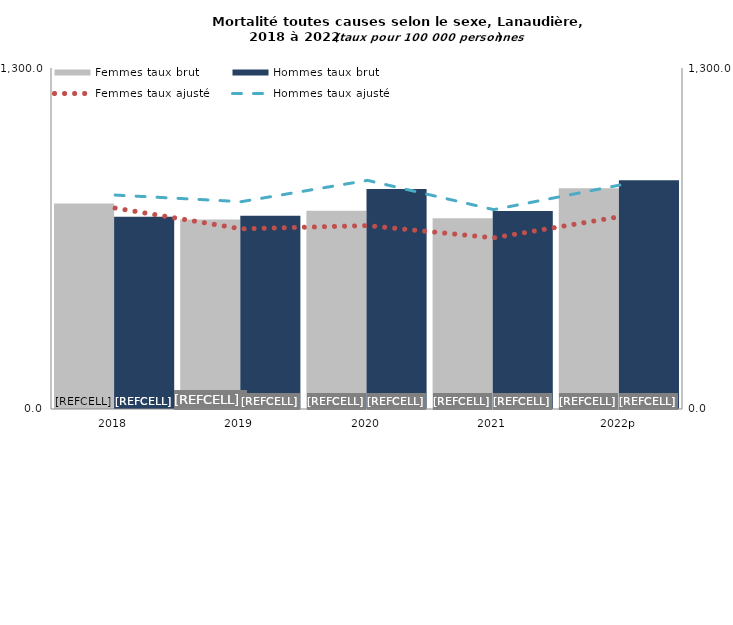
| Category | Femmes taux brut | Hommes taux brut |
|---|---|---|
| 2018 | 783.7 | 732.9 |
| 2019 | 722.4 | 737.2 |
| 2020 | 756.1 | 838.5 |
| 2021 | 726.8 | 755 |
| 2022p | 841.1 | 871.6 |